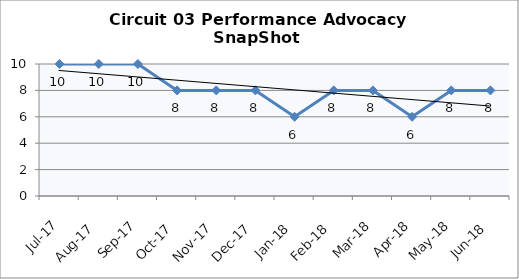
| Category | Circuit 03 |
|---|---|
| Jul-17 | 10 |
| Aug-17 | 10 |
| Sep-17 | 10 |
| Oct-17 | 8 |
| Nov-17 | 8 |
| Dec-17 | 8 |
| Jan-18 | 6 |
| Feb-18 | 8 |
| Mar-18 | 8 |
| Apr-18 | 6 |
| May-18 | 8 |
| Jun-18 | 8 |